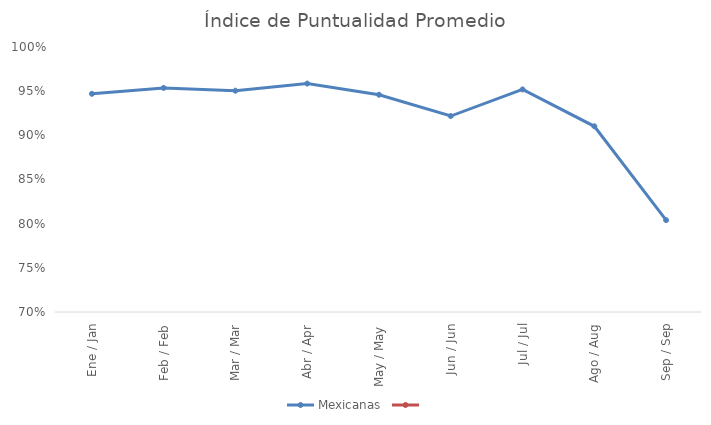
| Category | Mexicanas | Series 1 |
|---|---|---|
| Ene / Jan | 0.947 |  |
| Feb / Feb | 0.954 |  |
| Mar / Mar | 0.951 |  |
| Abr / Apr | 0.959 |  |
| May / May | 0.946 |  |
| Jun / Jun | 0.922 |  |
| Jul / Jul | 0.952 |  |
| Ago / Aug | 0.91 |  |
| Sep / Sep | 0.804 |  |